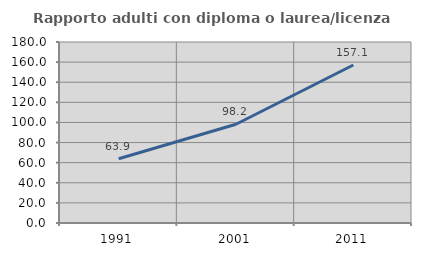
| Category | Rapporto adulti con diploma o laurea/licenza media  |
|---|---|
| 1991.0 | 63.914 |
| 2001.0 | 98.238 |
| 2011.0 | 157.143 |